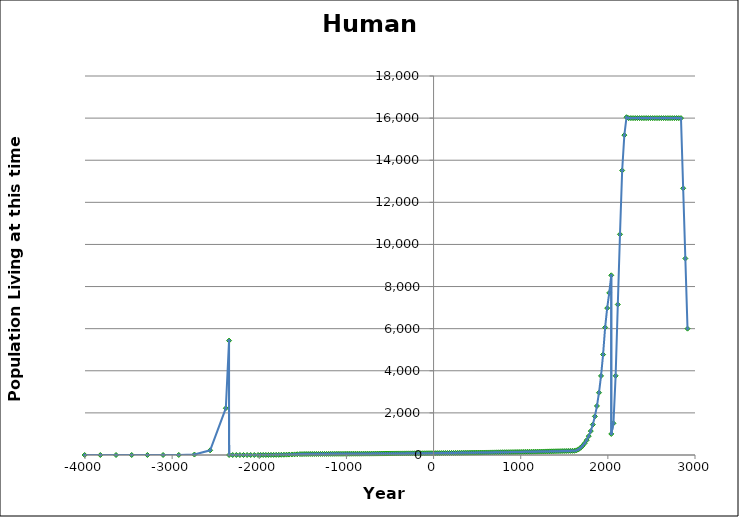
| Category | Human Population Estimates |
|---|---|
| -4004.0 | 0 |
| -3824.0 | 0 |
| -3644.0 | 0 |
| -3464.0 | 0.002 |
| -3284.0 | 0.022 |
| -3104.0 | 0.222 |
| -2924.0 | 2.222 |
| -2744.0 | 22.222 |
| -2564.0 | 222.222 |
| -2384.0 | 2222.22 |
| -2347.0 | 5432.795 |
| -2346.0 | 0 |
| -2304.75 | 0 |
| -2263.5 | 0 |
| -2222.25 | 0.001 |
| -2181.0 | 0.002 |
| -2139.75 | 0.008 |
| -2098.5 | 0.033 |
| -2057.25 | 0.131 |
| -2014.0 | 0.552 |
| -1984.3 | 1.071 |
| -1954.6 | 1.717 |
| -1924.9 | 2.508 |
| -1895.2 | 3.429 |
| -1865.5 | 4.282 |
| -1835.8 | 5.353 |
| -1806.1 | 6.691 |
| -1776.4 | 8.363 |
| -1746.7 | 10.454 |
| -1717.0 | 13.068 |
| -1687.3 | 16.335 |
| -1657.6 | 20.418 |
| -1626.4 | 25.609 |
| -1595.2 | 28.319 |
| -1564.0 | 35.731 |
| -1532.8 | 45.17 |
| -1509.3 | 43.452 |
| -1485.8 | 47.006 |
| -1462.3 | 47.476 |
| -1438.8 | 47.95 |
| -1415.3 | 48.43 |
| -1391.8 | 48.914 |
| -1368.3 | 49.403 |
| -1344.8 | 49.897 |
| -1321.3 | 50.396 |
| -1297.8 | 50.9 |
| -1274.3 | 51.409 |
| -1250.8 | 51.923 |
| -1227.3 | 52.443 |
| -1203.8 | 52.967 |
| -1180.3 | 53.497 |
| -1156.8 | 54.032 |
| -1133.3 | 54.572 |
| -1109.8 | 55.118 |
| -1086.3 | 55.669 |
| -1062.8 | 56.226 |
| -1039.3 | 56.788 |
| -1015.8 | 57.356 |
| -992.299999999999 | 57.929 |
| -968.799999999999 | 58.509 |
| -945.299999999999 | 59.094 |
| -921.799999999999 | 59.685 |
| -898.299999999999 | 60.282 |
| -874.799999999999 | 60.884 |
| -851.299999999999 | 61.493 |
| -827.799999999999 | 62.108 |
| -804.299999999999 | 62.729 |
| -780.799999999999 | 63.356 |
| -757.299999999999 | 63.99 |
| -733.799999999999 | 64.63 |
| -710.299999999999 | 65.276 |
| -686.799999999999 | 65.929 |
| -663.299999999999 | 66.588 |
| -639.799999999999 | 67.254 |
| -616.299999999999 | 67.927 |
| -592.799999999999 | 68.606 |
| -569.299999999999 | 69.292 |
| -545.799999999999 | 69.985 |
| -522.299999999999 | 70.685 |
| -498.799999999999 | 71.392 |
| -475.299999999999 | 72.106 |
| -451.799999999999 | 72.827 |
| -428.299999999999 | 73.555 |
| -404.799999999999 | 74.29 |
| -381.299999999999 | 75.033 |
| -357.799999999999 | 75.784 |
| -334.299999999999 | 76.542 |
| -310.799999999999 | 77.307 |
| -287.299999999999 | 78.08 |
| -263.799999999999 | 78.861 |
| -240.299999999999 | 79.649 |
| -216.799999999999 | 80.446 |
| -193.299999999999 | 81.25 |
| -169.799999999999 | 82.063 |
| -146.299999999999 | 82.884 |
| -122.799999999999 | 83.712 |
| -99.2999999999993 | 84.549 |
| -75.7999999999993 | 85.395 |
| -52.2999999999993 | 86.249 |
| -28.7999999999993 | 87.111 |
| -5.29999999999927 | 87.983 |
| 18.2000000000007 | 88.862 |
| 41.7000000000007 | 89.811 |
| 65.2000000000007 | 90.829 |
| 88.7000000000007 | 91.919 |
| 112.200000000001 | 93.022 |
| 135.700000000001 | 94.139 |
| 159.200000000001 | 95.268 |
| 182.700000000001 | 96.411 |
| 206.200000000001 | 97.568 |
| 229.700000000001 | 98.739 |
| 253.200000000001 | 99.924 |
| 276.700000000001 | 101.123 |
| 300.200000000001 | 102.337 |
| 323.700000000001 | 103.565 |
| 347.200000000001 | 104.807 |
| 370.700000000001 | 106.065 |
| 394.200000000001 | 107.338 |
| 417.700000000001 | 108.626 |
| 441.200000000001 | 109.929 |
| 464.700000000001 | 111.249 |
| 488.200000000001 | 112.584 |
| 511.700000000001 | 113.935 |
| 535.200000000001 | 115.302 |
| 558.700000000001 | 116.685 |
| 582.200000000001 | 118.086 |
| 605.700000000001 | 119.503 |
| 629.200000000001 | 120.937 |
| 652.700000000001 | 122.388 |
| 676.200000000001 | 123.857 |
| 699.700000000001 | 125.343 |
| 723.200000000001 | 126.847 |
| 746.700000000001 | 128.369 |
| 770.200000000001 | 129.91 |
| 793.700000000001 | 131.469 |
| 817.200000000001 | 133.046 |
| 840.700000000001 | 134.643 |
| 864.200000000001 | 136.258 |
| 887.700000000001 | 137.894 |
| 911.200000000001 | 139.548 |
| 934.700000000001 | 141.223 |
| 958.200000000001 | 142.917 |
| 981.700000000001 | 144.632 |
| 1005.2 | 146.368 |
| 1028.7 | 148.125 |
| 1052.2 | 149.902 |
| 1075.7 | 151.701 |
| 1099.2 | 153.521 |
| 1122.7 | 155.363 |
| 1146.2 | 157.228 |
| 1169.7 | 159.115 |
| 1193.2 | 161.024 |
| 1216.7 | 162.956 |
| 1240.2 | 164.912 |
| 1263.7 | 166.891 |
| 1287.2 | 168.893 |
| 1310.7 | 170.92 |
| 1334.2 | 172.971 |
| 1357.7 | 175.047 |
| 1381.2 | 177.147 |
| 1404.7 | 179.273 |
| 1428.2 | 181.424 |
| 1451.7 | 183.601 |
| 1475.2 | 185.805 |
| 1498.7 | 188.034 |
| 1522.2 | 190.291 |
| 1545.7 | 192.574 |
| 1569.2 | 194.885 |
| 1592.7 | 197.224 |
| 1616.2 | 199.59 |
| 1639.7 | 222.47 |
| 1663.2 | 268.488 |
| 1686.7 | 344.095 |
| 1710.2 | 437.001 |
| 1733.7 | 554.991 |
| 1757.2 | 704.838 |
| 1780.7 | 895.145 |
| 1804.2 | 1136.834 |
| 1827.7 | 1443.779 |
| 1851.2 | 1833.6 |
| 1874.7 | 2328.671 |
| 1898.2 | 2957.413 |
| 1921.7 | 3755.914 |
| 1945.2 | 4770.011 |
| 1968.7 | 6057.914 |
| 1992.2 | 6976.775 |
| 2015.7 | 7698.638 |
| 2039.2 | 8534.306 |
| 2039.2 | 1000 |
| 2064.2 | 1504.873 |
| 2089.2 | 3762.184 |
| 2114.2 | 7148.149 |
| 2139.2 | 10481.479 |
| 2164.2 | 13513.834 |
| 2189.2 | 15191.804 |
| 2214.2 | 16042.092 |
| 2239.2 | 15999.984 |
| 2264.2 | 15999.984 |
| 2289.2 | 15999.984 |
| 2314.2 | 15999.984 |
| 2339.2 | 15999.984 |
| 2364.2 | 15999.984 |
| 2389.2 | 15999.984 |
| 2414.2 | 15999.984 |
| 2439.2 | 15999.984 |
| 2464.2 | 15999.984 |
| 2489.2 | 15999.984 |
| 2514.2 | 15999.984 |
| 2539.2 | 15999.984 |
| 2564.2 | 15999.984 |
| 2589.2 | 15999.984 |
| 2614.2 | 15999.984 |
| 2639.2 | 15999.984 |
| 2664.2 | 15999.984 |
| 2689.2 | 15999.984 |
| 2714.2 | 15999.984 |
| 2739.2 | 15999.984 |
| 2764.2 | 15999.984 |
| 2789.2 | 15999.984 |
| 2814.2 | 15999.984 |
| 2839.2 | 15999.984 |
| 2864.2 | 12666.654 |
| 2889.2 | 9333.324 |
| 2914.2 | 5999.994 |